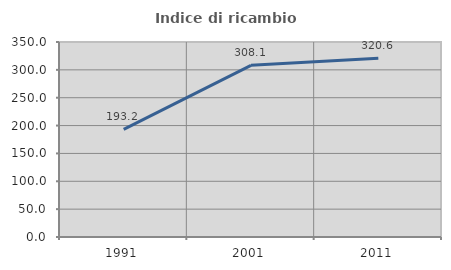
| Category | Indice di ricambio occupazionale  |
|---|---|
| 1991.0 | 193.168 |
| 2001.0 | 308.14 |
| 2011.0 | 320.619 |